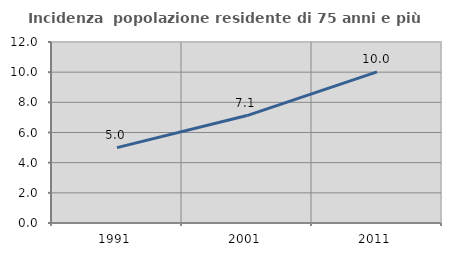
| Category | Incidenza  popolazione residente di 75 anni e più |
|---|---|
| 1991.0 | 4.997 |
| 2001.0 | 7.123 |
| 2011.0 | 10.023 |